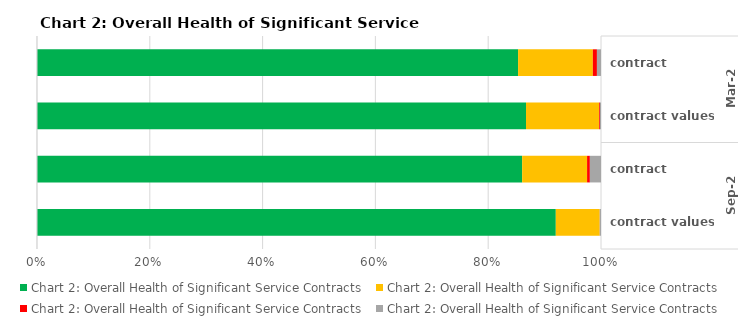
| Category | Green | Amber | Red | No Data |
|---|---|---|---|---|
| 0 | 354 | 55 | 3 | 3 |
| 1 | 17412036736.5 | 2600107733.1 | 30000000 | 40000000 |
| 2 | 523 | 70 | 3 | 12 |
| 3 | 26879909069.371 | 2274463721.34 | 3000000 | 64100000 |